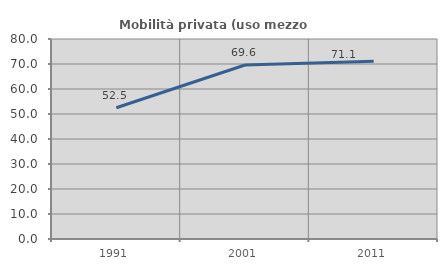
| Category | Mobilità privata (uso mezzo privato) |
|---|---|
| 1991.0 | 52.508 |
| 2001.0 | 69.598 |
| 2011.0 | 71.082 |